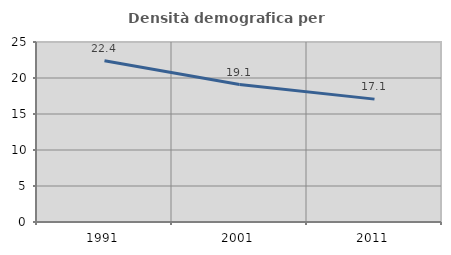
| Category | Densità demografica |
|---|---|
| 1991.0 | 22.408 |
| 2001.0 | 19.097 |
| 2011.0 | 17.067 |